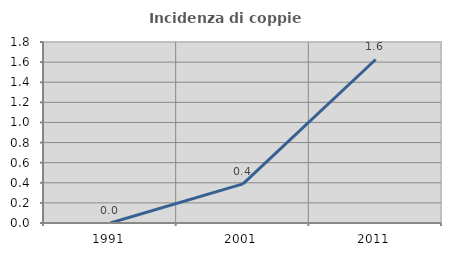
| Category | Incidenza di coppie miste |
|---|---|
| 1991.0 | 0 |
| 2001.0 | 0.389 |
| 2011.0 | 1.626 |